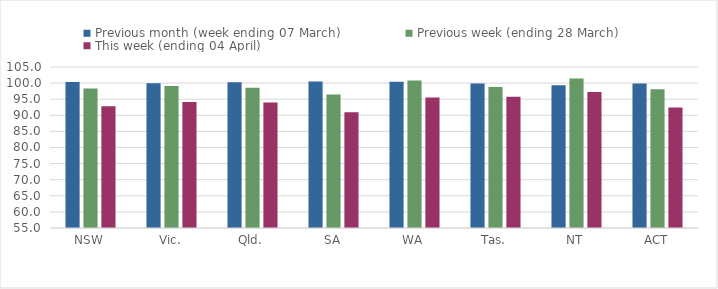
| Category | Previous month (week ending 07 March) | Previous week (ending 28 March) | This week (ending 04 April) |
|---|---|---|---|
| NSW | 100.379 | 98.305 | 92.781 |
| Vic. | 99.919 | 99.118 | 94.115 |
| Qld. | 100.263 | 98.528 | 94.001 |
| SA | 100.467 | 96.436 | 90.93 |
| WA | 100.455 | 100.825 | 95.503 |
| Tas. | 99.874 | 98.805 | 95.723 |
| NT | 99.356 | 101.417 | 97.231 |
| ACT | 99.841 | 98.094 | 92.454 |